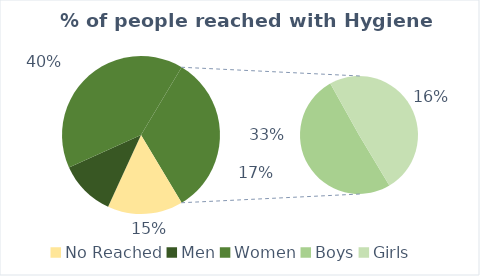
| Category | Series 0 |
|---|---|
| No Reached | 18510 |
| Men | 13687 |
| Women | 48347 |
| Boys | 19855 |
| Girls | 19453 |